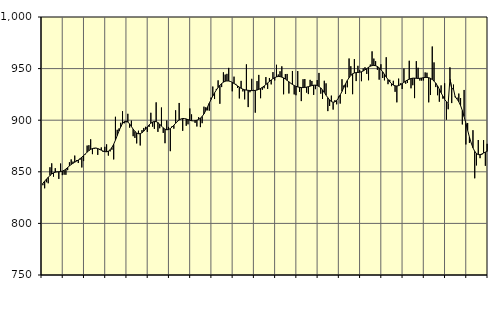
| Category | Piggar | Series 1 |
|---|---|---|
| nan | 837 | 838.9 |
| 1.0 | 834 | 840.96 |
| 1.0 | 839.9 | 842.87 |
| 1.0 | 838.9 | 844.65 |
| 1.0 | 854.4 | 846.36 |
| 1.0 | 858.2 | 847.87 |
| 1.0 | 845.3 | 848.96 |
| 1.0 | 853.5 | 849.65 |
| 1.0 | 850.2 | 849.94 |
| 1.0 | 843.1 | 850.06 |
| 1.0 | 858 | 850.23 |
| 1.0 | 846.8 | 850.65 |
| nan | 847.2 | 851.45 |
| 2.0 | 847.1 | 852.67 |
| 2.0 | 851.6 | 854.14 |
| 2.0 | 859.2 | 855.68 |
| 2.0 | 862 | 857.07 |
| 2.0 | 859.9 | 858.26 |
| 2.0 | 865.7 | 859.32 |
| 2.0 | 861.2 | 860.35 |
| 2.0 | 858.5 | 861.45 |
| 2.0 | 861.7 | 862.71 |
| 2.0 | 854.2 | 864.14 |
| 2.0 | 860.4 | 865.7 |
| nan | 866.9 | 867.37 |
| 3.0 | 875.4 | 869.02 |
| 3.0 | 875.8 | 870.52 |
| 3.0 | 881.5 | 871.74 |
| 3.0 | 867.1 | 872.55 |
| 3.0 | 872.2 | 872.94 |
| 3.0 | 873.2 | 872.95 |
| 3.0 | 866.4 | 872.54 |
| 3.0 | 871.2 | 871.82 |
| 3.0 | 873.6 | 870.94 |
| 3.0 | 869.3 | 870.08 |
| 3.0 | 874.2 | 869.51 |
| nan | 876.6 | 869.43 |
| 4.0 | 865.7 | 869.99 |
| 4.0 | 869.8 | 871.36 |
| 4.0 | 871.4 | 873.59 |
| 4.0 | 862 | 876.74 |
| 4.0 | 903.3 | 880.7 |
| 4.0 | 890.7 | 885.12 |
| 4.0 | 892 | 889.56 |
| 4.0 | 897.5 | 893.59 |
| 4.0 | 908.7 | 896.74 |
| 4.0 | 897 | 898.63 |
| 4.0 | 897.9 | 899.1 |
| nan | 906.2 | 898.25 |
| 5.0 | 892.8 | 896.38 |
| 5.0 | 899.6 | 893.91 |
| 5.0 | 884.5 | 891.32 |
| 5.0 | 882.8 | 889.13 |
| 5.0 | 877.5 | 887.59 |
| 5.0 | 889.8 | 886.86 |
| 5.0 | 875.5 | 887.01 |
| 5.0 | 890.4 | 887.88 |
| 5.0 | 892.5 | 889.34 |
| 5.0 | 893.6 | 891.27 |
| 5.0 | 888.7 | 893.39 |
| nan | 893.5 | 895.38 |
| 6.0 | 907.2 | 897.06 |
| 6.0 | 893.7 | 898.25 |
| 6.0 | 891.6 | 898.79 |
| 6.0 | 917.3 | 898.6 |
| 6.0 | 888.7 | 897.68 |
| 6.0 | 892.2 | 896.13 |
| 6.0 | 912.3 | 894.28 |
| 6.0 | 887.7 | 892.57 |
| 6.0 | 877.7 | 891.29 |
| 6.0 | 899.7 | 890.71 |
| 6.0 | 893.5 | 890.95 |
| nan | 870 | 891.92 |
| 7.0 | 894.2 | 893.39 |
| 7.0 | 891.8 | 895.15 |
| 7.0 | 909.6 | 897.02 |
| 7.0 | 899.4 | 898.79 |
| 7.0 | 916.7 | 900.19 |
| 7.0 | 900.9 | 901.18 |
| 7.0 | 889.7 | 901.67 |
| 7.0 | 901.7 | 901.61 |
| 7.0 | 894.6 | 901.2 |
| 7.0 | 896 | 900.57 |
| 7.0 | 911.4 | 899.92 |
| nan | 905.6 | 899.49 |
| 8.0 | 899.3 | 899.35 |
| 8.0 | 897.4 | 899.5 |
| 8.0 | 893.9 | 899.96 |
| 8.0 | 902.9 | 900.75 |
| 8.0 | 893.3 | 901.95 |
| 8.0 | 897.1 | 903.68 |
| 8.0 | 913.1 | 906.1 |
| 8.0 | 912.5 | 909.22 |
| 8.0 | 909.6 | 912.77 |
| 8.0 | 909.2 | 916.48 |
| 8.0 | 921.9 | 920.09 |
| nan | 932.6 | 923.45 |
| 9.0 | 920.5 | 926.51 |
| 9.0 | 930.3 | 929.25 |
| 9.0 | 938.6 | 931.67 |
| 9.0 | 915.9 | 933.79 |
| 9.0 | 932.1 | 935.52 |
| 9.0 | 946.4 | 936.84 |
| 9.0 | 944.2 | 937.75 |
| 9.0 | 944.9 | 938.07 |
| 9.0 | 950.7 | 937.96 |
| 9.0 | 937.7 | 937.51 |
| 9.0 | 928 | 936.72 |
| nan | 942.2 | 935.61 |
| 10.0 | 935.2 | 934.42 |
| 10.0 | 931.2 | 933.25 |
| 10.0 | 921.1 | 932.05 |
| 10.0 | 938.1 | 930.94 |
| 10.0 | 927.9 | 930.08 |
| 10.0 | 920.2 | 929.51 |
| 10.0 | 954.1 | 929.16 |
| 10.0 | 912.7 | 928.96 |
| 10.0 | 927.1 | 928.79 |
| 10.0 | 940.1 | 928.68 |
| 10.0 | 929.4 | 928.7 |
| nan | 907.3 | 928.87 |
| 11.0 | 937.9 | 929.24 |
| 11.0 | 943.9 | 929.88 |
| 11.0 | 921.3 | 930.77 |
| 11.0 | 929.5 | 931.85 |
| 11.0 | 931 | 933.13 |
| 11.0 | 941.8 | 934.58 |
| 11.0 | 930.3 | 936.07 |
| 11.0 | 940.9 | 937.55 |
| 11.0 | 934.7 | 939.04 |
| 11.0 | 946.6 | 940.29 |
| 11.0 | 938.5 | 941.26 |
| nan | 953.7 | 942.01 |
| 12.0 | 944.3 | 942.38 |
| 12.0 | 947.4 | 942.25 |
| 12.0 | 952.2 | 941.75 |
| 12.0 | 925.1 | 940.98 |
| 12.0 | 944.7 | 939.89 |
| 12.0 | 944.8 | 938.59 |
| 12.0 | 925.9 | 937.22 |
| 12.0 | 936.1 | 935.88 |
| 12.0 | 947.7 | 934.63 |
| 12.0 | 925 | 933.58 |
| 12.0 | 924.2 | 932.79 |
| nan | 947.6 | 932.26 |
| 13.0 | 927.5 | 931.88 |
| 13.0 | 918.5 | 931.63 |
| 13.0 | 939.7 | 931.59 |
| 13.0 | 939.9 | 931.74 |
| 13.0 | 926.7 | 932.05 |
| 13.0 | 925.3 | 932.47 |
| 13.0 | 939.1 | 933.01 |
| 13.0 | 938 | 933.56 |
| 13.0 | 924.5 | 933.94 |
| 13.0 | 930.1 | 933.98 |
| 13.0 | 938.9 | 933.64 |
| nan | 945.8 | 932.75 |
| 14.0 | 925.7 | 931.29 |
| 14.0 | 920.6 | 929.31 |
| 14.0 | 938.2 | 926.89 |
| 14.0 | 935.7 | 924.25 |
| 14.0 | 908.8 | 921.75 |
| 14.0 | 913.8 | 919.62 |
| 14.0 | 923.8 | 918.06 |
| 14.0 | 910.3 | 917.37 |
| 14.0 | 919.4 | 917.7 |
| 14.0 | 915.4 | 919.13 |
| 14.0 | 922.9 | 921.47 |
| nan | 916.1 | 924.48 |
| 15.0 | 939.7 | 927.96 |
| 15.0 | 933.6 | 931.69 |
| 15.0 | 925.4 | 935.28 |
| 15.0 | 931.9 | 938.46 |
| 15.0 | 959.8 | 941.19 |
| 15.0 | 952.3 | 943.41 |
| 15.0 | 925.2 | 944.94 |
| 15.0 | 959.2 | 945.79 |
| 15.0 | 937.9 | 946.15 |
| 15.0 | 952.7 | 946.28 |
| 15.0 | 948.5 | 946.49 |
| nan | 937.8 | 946.93 |
| 16.0 | 950.1 | 947.7 |
| 16.0 | 951.3 | 948.78 |
| 16.0 | 944.8 | 950.02 |
| 16.0 | 938.7 | 951.27 |
| 16.0 | 953.9 | 952.28 |
| 16.0 | 966.7 | 952.89 |
| 16.0 | 959.7 | 953.07 |
| 16.0 | 957.2 | 952.81 |
| 16.0 | 948.8 | 952.04 |
| 16.0 | 939.3 | 950.79 |
| 16.0 | 954.2 | 949.01 |
| nan | 940.9 | 946.86 |
| 17.0 | 938.6 | 944.43 |
| 17.0 | 961 | 941.86 |
| 17.0 | 934.9 | 939.4 |
| 17.0 | 939.1 | 937.19 |
| 17.0 | 933 | 935.37 |
| 17.0 | 938.2 | 934.02 |
| 17.0 | 927.5 | 933.29 |
| 17.0 | 917.3 | 933.15 |
| 17.0 | 940.3 | 933.52 |
| 17.0 | 935.7 | 934.34 |
| 17.0 | 930.2 | 935.47 |
| nan | 950 | 936.74 |
| 18.0 | 935.3 | 937.96 |
| 18.0 | 936.1 | 938.95 |
| 18.0 | 957.6 | 939.7 |
| 18.0 | 930.9 | 940.37 |
| 18.0 | 933.9 | 940.75 |
| 18.0 | 921.4 | 940.77 |
| 18.0 | 957.2 | 940.59 |
| 18.0 | 950.8 | 940.48 |
| 18.0 | 938.4 | 940.6 |
| 18.0 | 938.4 | 940.85 |
| 18.0 | 938.5 | 941.19 |
| nan | 946.3 | 941.4 |
| 19.0 | 946 | 941.41 |
| 19.0 | 917.3 | 941.19 |
| 19.0 | 924.4 | 940.54 |
| 19.0 | 971.4 | 939.44 |
| 19.0 | 956 | 937.9 |
| 19.0 | 932.1 | 935.85 |
| 19.0 | 924.2 | 933.25 |
| 19.0 | 917.9 | 930.07 |
| 19.0 | 933.7 | 926.61 |
| 19.0 | 920.9 | 923.29 |
| 19.0 | 935.8 | 920.28 |
| nan | 900.5 | 917.89 |
| 20.0 | 910.6 | 916.21 |
| 20.0 | 951.2 | 940.38 |
| 20.0 | 916.6 | 930.84 |
| 20.0 | 934.5 | 930.16 |
| 20.0 | 923 | 922.27 |
| 20.0 | 921.9 | 920.47 |
| 20.0 | 925.8 | 917.83 |
| 20.0 | 921.5 | 914.17 |
| 20.0 | 895.9 | 909.39 |
| 20.0 | 929.3 | 903.52 |
| 20.0 | 876.5 | 896.98 |
| nan | 897.3 | 890.21 |
| 21.0 | 878 | 883.74 |
| 21.0 | 877.9 | 877.98 |
| 21.0 | 890.3 | 873.25 |
| 21.0 | 843.7 | 869.81 |
| 21.0 | 856.2 | 867.65 |
| 21.0 | 880.8 | 866.68 |
| 21.0 | 863.2 | 866.64 |
| 21.0 | 866.5 | 867.25 |
| 21.0 | 880.7 | 868.18 |
| 21.0 | 855.8 | 869.11 |
| 21.0 | 877.1 | 869.73 |